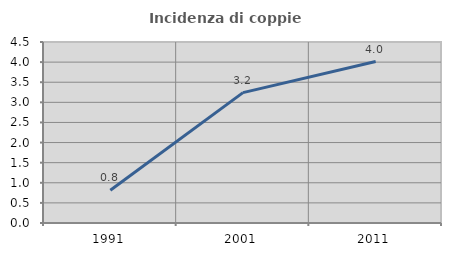
| Category | Incidenza di coppie miste |
|---|---|
| 1991.0 | 0.814 |
| 2001.0 | 3.242 |
| 2011.0 | 4.015 |